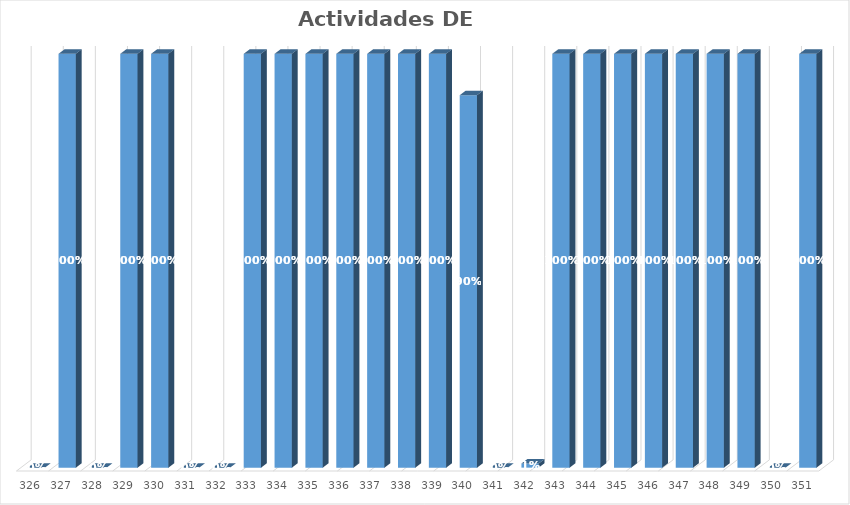
| Category | % Avance |
|---|---|
| 326.0 | 0 |
| 327.0 | 1 |
| 328.0 | 0 |
| 329.0 | 1 |
| 330.0 | 1 |
| 331.0 | 0 |
| 332.0 | 0 |
| 333.0 | 1 |
| 334.0 | 1 |
| 335.0 | 1 |
| 336.0 | 1 |
| 337.0 | 1 |
| 338.0 | 1 |
| 339.0 | 1 |
| 340.0 | 0.9 |
| 341.0 | 0 |
| 342.0 | 0.01 |
| 343.0 | 1 |
| 344.0 | 1 |
| 345.0 | 1 |
| 346.0 | 1 |
| 347.0 | 1 |
| 348.0 | 1 |
| 349.0 | 1 |
| 350.0 | 0 |
| 351.0 | 1 |